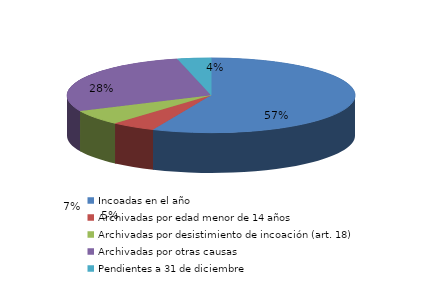
| Category | Series 0 |
|---|---|
| Incoadas en el año | 994 |
| Archivadas por edad menor de 14 años | 88 |
| Archivadas por desistimiento de incoación (art. 18) | 115 |
| Archivadas por otras causas | 494 |
| Pendientes a 31 de diciembre | 66 |